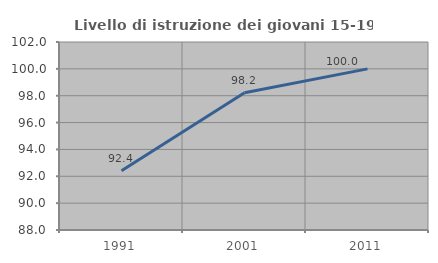
| Category | Livello di istruzione dei giovani 15-19 anni |
|---|---|
| 1991.0 | 92.405 |
| 2001.0 | 98.214 |
| 2011.0 | 100 |